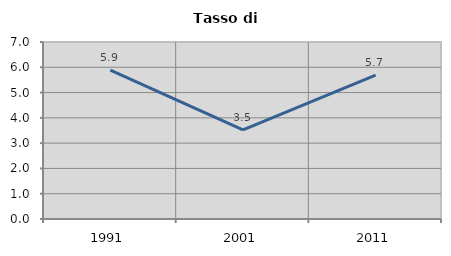
| Category | Tasso di disoccupazione   |
|---|---|
| 1991.0 | 5.889 |
| 2001.0 | 3.521 |
| 2011.0 | 5.689 |